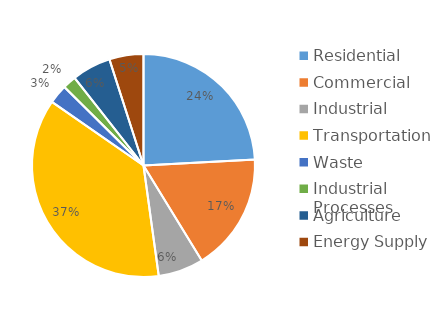
| Category | MTCO2e* |
|---|---|
| Residential | 3893424 |
| Commercial | 2755277 |
| Industrial | 1059478 |
| Transportation | 5939421.03 |
| Waste | 446347 |
| Industrial Processes | 315965 |
| Agriculture | 913091 |
| Energy Supply | 796914 |